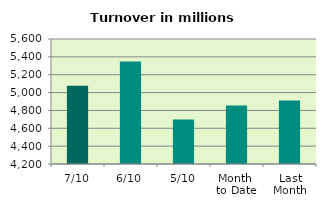
| Category | Series 0 |
|---|---|
| 7/10 | 5075.632 |
| 6/10 | 5346.746 |
| 5/10 | 4698.776 |
| Month 
to Date | 4854.362 |
| Last
Month | 4910.879 |